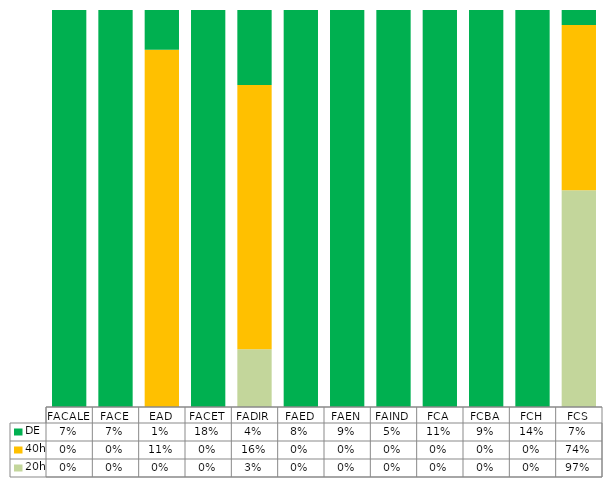
| Category | 20h | 40h | DE |
|---|---|---|---|
| FACALE | 0 | 0 | 0.072 |
| FACE | 0 | 0 | 0.072 |
| EAD | 0 | 0.105 | 0.012 |
| FACET | 0 | 0 | 0.179 |
| FADIR | 0.034 | 0.158 | 0.045 |
| FAED | 0 | 0 | 0.076 |
| FAEN | 0 | 0 | 0.088 |
| FAIND | 0 | 0 | 0.051 |
| FCA | 0 | 0 | 0.109 |
| FCBA | 0 | 0 | 0.092 |
| FCH | 0 | 0 | 0.138 |
| FCS | 0.966 | 0.737 | 0.066 |